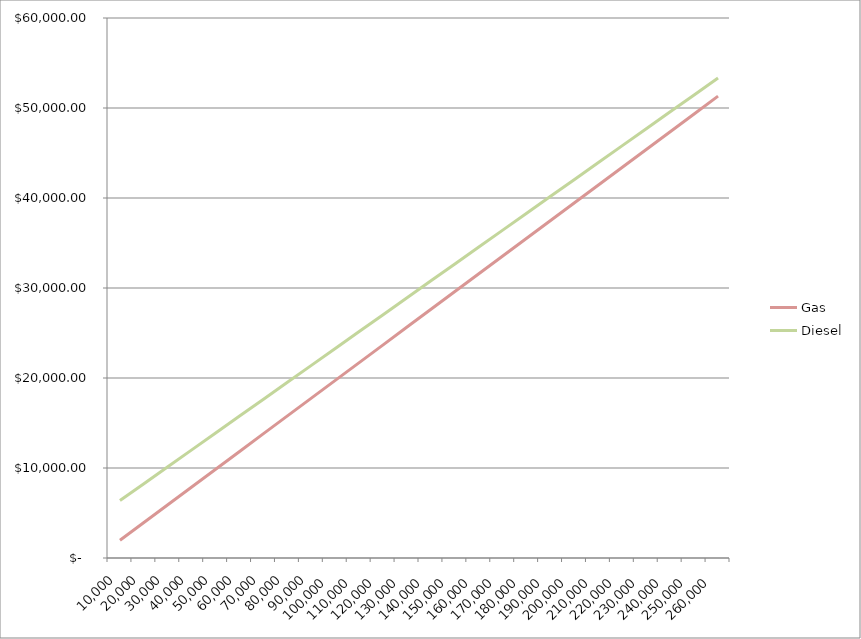
| Category | Gas | Diesel |
|---|---|---|
| 10000.0 | 1973.684 | 6378.182 |
| 20000.0 | 3947.368 | 8256.364 |
| 30000.0 | 5921.053 | 10134.545 |
| 40000.0 | 7894.737 | 12012.727 |
| 50000.0 | 9868.421 | 13890.909 |
| 60000.0 | 11842.105 | 15769.091 |
| 70000.0 | 13815.789 | 17647.273 |
| 80000.0 | 15789.474 | 19525.455 |
| 90000.0 | 17763.158 | 21403.636 |
| 100000.0 | 19736.842 | 23281.818 |
| 110000.0 | 21710.526 | 25160 |
| 120000.0 | 23684.211 | 27038.182 |
| 130000.0 | 25657.895 | 28916.364 |
| 140000.0 | 27631.579 | 30794.545 |
| 150000.0 | 29605.263 | 32672.727 |
| 160000.0 | 31578.947 | 34550.909 |
| 170000.0 | 33552.632 | 36429.091 |
| 180000.0 | 35526.316 | 38307.273 |
| 190000.0 | 37500 | 40185.455 |
| 200000.0 | 39473.684 | 42063.636 |
| 210000.0 | 41447.368 | 43941.818 |
| 220000.0 | 43421.053 | 45820 |
| 230000.0 | 45394.737 | 47698.182 |
| 240000.0 | 47368.421 | 49576.364 |
| 250000.0 | 49342.105 | 51454.545 |
| 260000.0 | 51315.789 | 53332.727 |